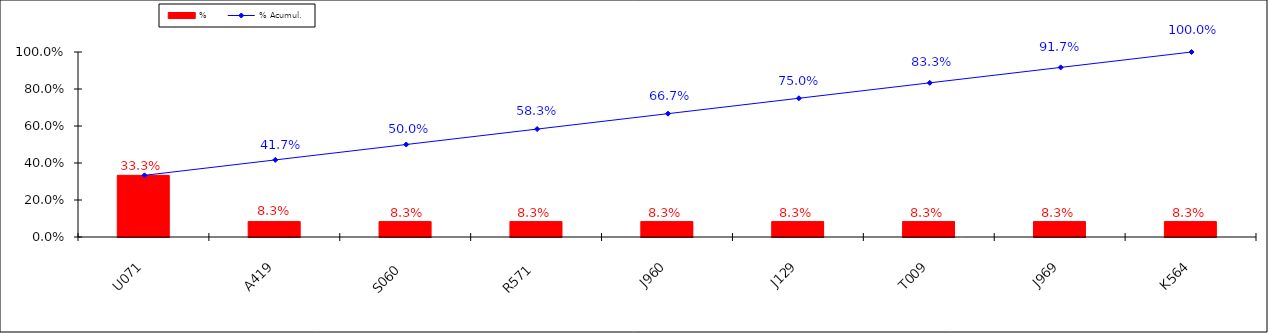
| Category | % |
|---|---|
| U071 | 0.333 |
| A419 | 0.083 |
| S060 | 0.083 |
| R571 | 0.083 |
| J960 | 0.083 |
| J129 | 0.083 |
| T009 | 0.083 |
| J969 | 0.083 |
| K564 | 0.083 |